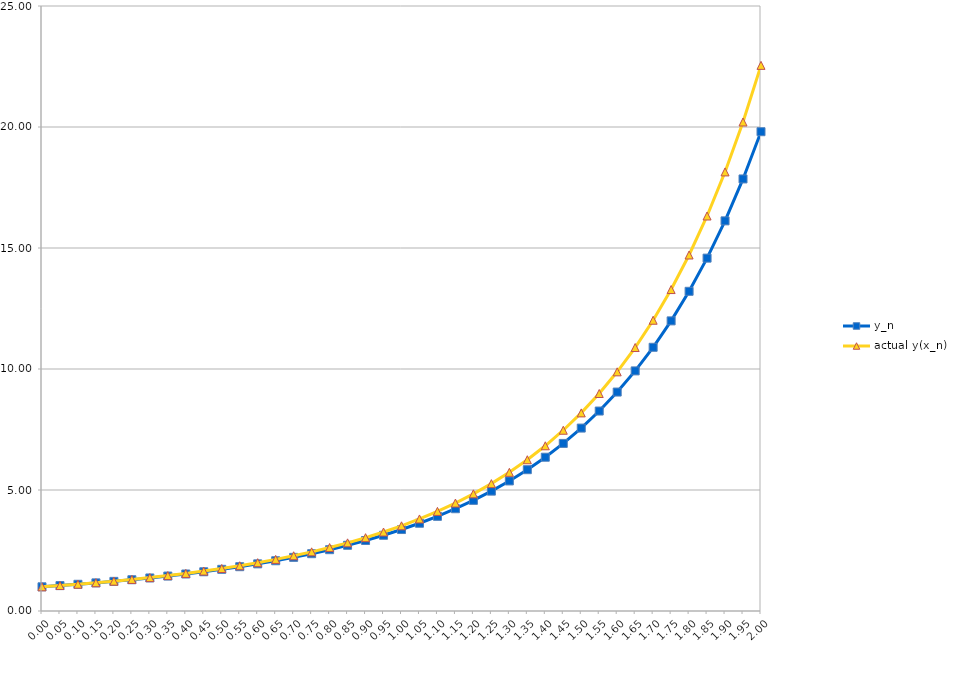
| Category | y_n | actual y(x_n) |
|---|---|---|
| 0.00 | 1 | 1 |
| 0.05 | 1.05 | 1.052 |
| 0.10 | 1.104 | 1.108 |
| 0.15 | 1.162 | 1.168 |
| 0.20 | 1.225 | 1.234 |
| 0.25 | 1.292 | 1.304 |
| 0.30 | 1.365 | 1.381 |
| 0.35 | 1.444 | 1.463 |
| 0.40 | 1.529 | 1.553 |
| 0.45 | 1.622 | 1.65 |
| 0.50 | 1.722 | 1.756 |
| 0.55 | 1.831 | 1.871 |
| 0.60 | 1.949 | 1.996 |
| 0.65 | 2.077 | 2.132 |
| 0.70 | 2.216 | 2.281 |
| 0.75 | 2.368 | 2.444 |
| 0.80 | 2.534 | 2.621 |
| 0.85 | 2.715 | 2.816 |
| 0.90 | 2.913 | 3.029 |
| 0.95 | 3.129 | 3.263 |
| 1.00 | 3.366 | 3.521 |
| 1.05 | 3.626 | 3.804 |
| 1.10 | 3.912 | 4.116 |
| 1.15 | 4.226 | 4.461 |
| 1.20 | 4.572 | 4.842 |
| 1.25 | 4.953 | 5.263 |
| 1.30 | 5.374 | 5.731 |
| 1.35 | 5.839 | 6.25 |
| 1.40 | 6.354 | 6.827 |
| 1.45 | 6.925 | 7.469 |
| 1.50 | 7.559 | 8.186 |
| 1.55 | 8.263 | 8.987 |
| 1.60 | 9.047 | 9.883 |
| 1.65 | 9.921 | 10.887 |
| 1.70 | 10.897 | 12.015 |
| 1.75 | 11.989 | 13.283 |
| 1.80 | 13.211 | 14.711 |
| 1.85 | 14.581 | 16.322 |
| 1.90 | 16.121 | 18.144 |
| 1.95 | 17.853 | 20.207 |
| 2.00 | 19.805 | 22.547 |